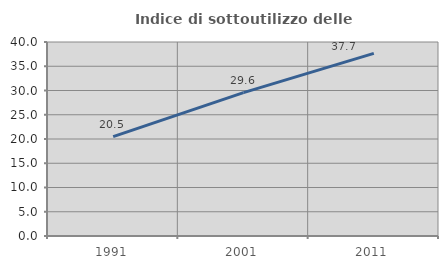
| Category | Indice di sottoutilizzo delle abitazioni  |
|---|---|
| 1991.0 | 20.487 |
| 2001.0 | 29.558 |
| 2011.0 | 37.66 |